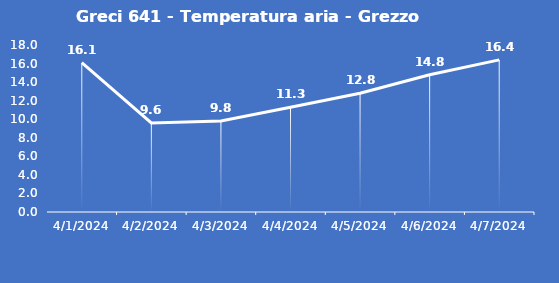
| Category | Greci 641 - Temperatura aria - Grezzo (°C) |
|---|---|
| 4/1/24 | 16.1 |
| 4/2/24 | 9.6 |
| 4/3/24 | 9.8 |
| 4/4/24 | 11.3 |
| 4/5/24 | 12.8 |
| 4/6/24 | 14.8 |
| 4/7/24 | 16.4 |